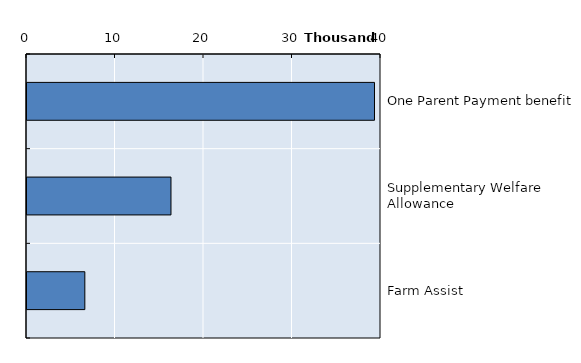
| Category | Series 0 |
|---|---|
| One Parent Payment benefit | 39265 |
| Supplementary Welfare Allowance | 16269 |
| Farm Assist | 6535 |